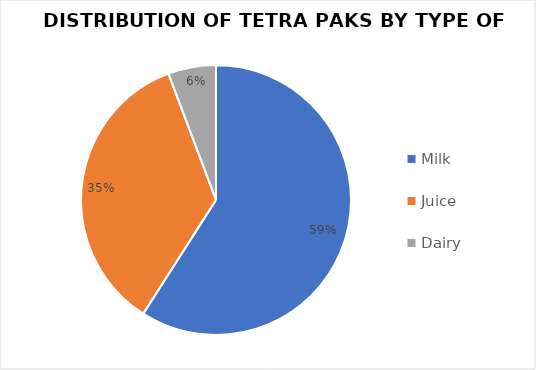
| Category | Series 0 |
|---|---|
| Milk | 515 |
| Juice | 307 |
| Dairy | 50 |